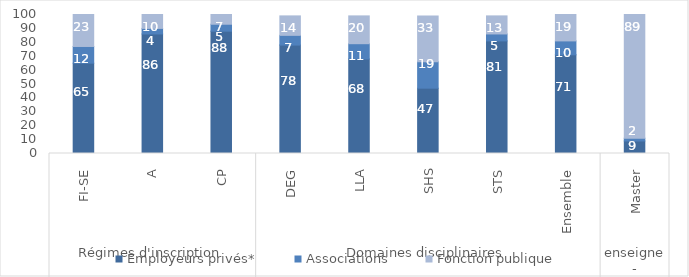
| Category | Employeurs privés* | Associations | Fonction publique |
|---|---|---|---|
| 0 | 65 | 12 | 23 |
| 1 | 86 | 4 | 10 |
| 2 | 88 | 5 | 7 |
| 3 | 78 | 7 | 14 |
| 4 | 68 | 11 | 20 |
| 5 | 47 | 19 | 33 |
| 6 | 81 | 5 | 13 |
| 7 | 71 | 10 | 19 |
| 8 | 9 | 2 | 89 |